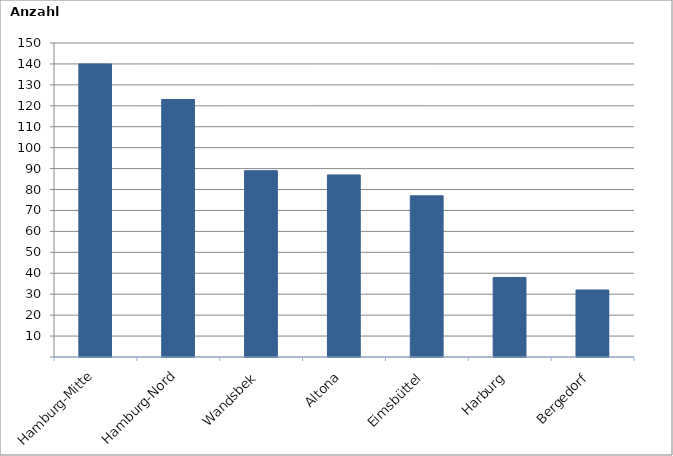
| Category | Series 0 |
|---|---|
| Hamburg-Mitte | 140 |
| Hamburg-Nord | 123 |
| Wandsbek | 89 |
| Altona | 87 |
| Eimsbüttel | 77 |
| Harburg | 38 |
| Bergedorf | 32 |